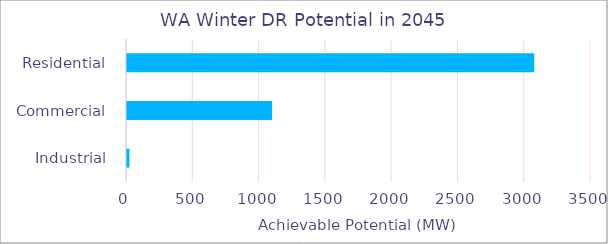
| Category | Series 0 |
|---|---|
|  Residential  | 3079.564 |
|  Commercial  | 1102.018 |
|  Industrial  | 25.915 |